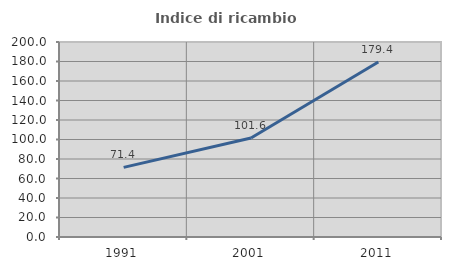
| Category | Indice di ricambio occupazionale  |
|---|---|
| 1991.0 | 71.389 |
| 2001.0 | 101.605 |
| 2011.0 | 179.422 |